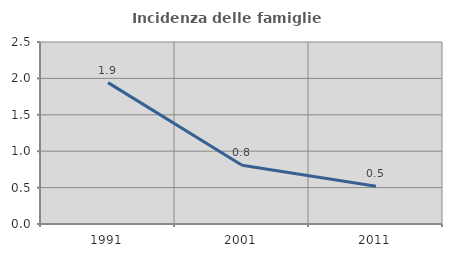
| Category | Incidenza delle famiglie numerose |
|---|---|
| 1991.0 | 1.942 |
| 2001.0 | 0.808 |
| 2011.0 | 0.519 |